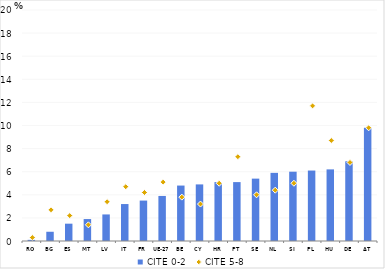
| Category | CITE 0-2 |
|---|---|
| RO | 0.1 |
| BG | 0.8 |
| ES | 1.5 |
| MT | 1.9 |
| LV | 2.3 |
| IT | 3.2 |
| FR | 3.5 |
| UE-27 | 3.9 |
| BE | 4.8 |
| CY | 4.9 |
| HR | 5.1 |
| PT | 5.1 |
| SE | 5.4 |
| NL | 5.9 |
| SI | 6 |
| PL | 6.1 |
| HU | 6.2 |
| DE | 6.9 |
| AT | 9.8 |